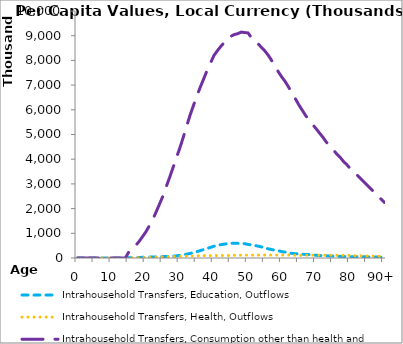
| Category | Intrahousehold Transfers, Education, Outflows | Intrahousehold Transfers, Health, Outflows | Intrahousehold Transfers, Consumption other than health and education, Outflows | Intrahousehold Transfers, Saving, Outflows |
|---|---|---|---|---|
| 0 | 0 | 0 | 0 |  |
|  | 0 | 0 | 0 |  |
| 2 | 0 | 0 | 0 |  |
| 3 | 0 | 0 | 0 |  |
| 4 | 0 | 0 | 0 |  |
| 5 | 0 | 0 | 0 |  |
| 6 | 0 | 0 | 0 |  |
| 7 | 0 | 0 | 0 |  |
| 8 | 0 | 0 | 0 |  |
| 9 | 0 | 0 | 0 |  |
| 10 | 0 | 0 | 0 |  |
| 11 | 0 | 0 | 0 |  |
| 12 | 0 | 0 | 0 |  |
| 13 | 0 | 0 | 0 |  |
| 14 | 0 | 0 | 0 |  |
| 15 | 6898.66 | 5283.315 | 248237.836 |  |
| 16 | 9263.999 | 7232.893 | 376351.637 |  |
| 17 | 17369.687 | 9507.442 | 503630.638 |  |
| 18 | 20683.305 | 12547.604 | 666005.278 |  |
| 19 | 26691.801 | 16215.035 | 858631.54 |  |
| 20 | 31337.736 | 20020.315 | 1054741.593 |  |
| 21 | 35436.758 | 24162.062 | 1300543.452 |  |
| 22 | 40646.974 | 29086.468 | 1555053.769 |  |
| 23 | 45078.263 | 33525.204 | 1859058.324 |  |
| 24 | 48808.917 | 38159.967 | 2178820.773 |  |
| 25 | 55820.035 | 43856.585 | 2502144.842 |  |
| 26 | 60487.497 | 49572.989 | 2895508.065 |  |
| 27 | 70376.137 | 55174.237 | 3267827.011 |  |
| 28 | 75083.46 | 60320.724 | 3670223.696 |  |
| 29 | 87960.635 | 64864.77 | 4070514.872 |  |
| 30 | 106983.762 | 70504.138 | 4462250.354 |  |
| 31 | 124298.205 | 75625.5 | 4892116.498 |  |
| 32 | 155892.588 | 80278.356 | 5349537.712 |  |
| 33 | 185179.708 | 84596.598 | 5787340.105 |  |
| 34 | 218114.581 | 87639.731 | 6182093.733 |  |
| 35 | 256655.219 | 91574.236 | 6565975.264 |  |
| 36 | 298279.693 | 93772.498 | 6923216.338 |  |
| 37 | 344487.798 | 95822.002 | 7259702.148 |  |
| 38 | 384155.788 | 97472.29 | 7598806.048 |  |
| 39 | 432541.035 | 98708.456 | 7901494.403 |  |
| 40 | 477858.419 | 100268.376 | 8200566.88 |  |
| 41 | 508624.412 | 99748.705 | 8392157.778 |  |
| 42 | 540060.569 | 100553.999 | 8565830.409 |  |
| 43 | 559664.053 | 100312.871 | 8724307.423 |  |
| 44 | 583237.356 | 99236.506 | 8875114.278 |  |
| 45 | 593608.674 | 113003.067 | 8978274.063 |  |
| 46 | 599738.797 | 113028.297 | 9047861.033 |  |
| 47 | 595763.359 | 113192.237 | 9082012.607 |  |
| 48 | 587447.403 | 115019.595 | 9147550.838 |  |
| 49 | 579122.002 | 115270.994 | 9126893.057 |  |
| 50 | 550232.024 | 116638.486 | 9112160.468 |  |
| 51 | 528666.956 | 115938.99 | 8917197.42 |  |
| 52 | 507822.441 | 118515.163 | 8805148.789 |  |
| 53 | 478683.746 | 118119.15 | 8664357.739 |  |
| 54 | 447897.24 | 119044.073 | 8517620.146 |  |
| 55 | 406220.54 | 120230.331 | 8372814.642 |  |
| 56 | 370515.06 | 119021.212 | 8195481.05 |  |
| 57 | 341215.076 | 118159.129 | 7981334.539 |  |
| 58 | 307058.746 | 119112.411 | 7743020.042 |  |
| 59 | 287911.377 | 118459.936 | 7515543.152 |  |
| 60 | 255679.255 | 120317.462 | 7310929.834 |  |
| 61 | 236258.799 | 121108.631 | 7124678.1 |  |
| 62 | 203028.737 | 121879.649 | 6896699.916 |  |
| 63 | 184991.571 | 121744.584 | 6654571.581 |  |
| 64 | 173269.928 | 111506.816 | 6425259.826 |  |
| 65 | 159552.713 | 110079.832 | 6179565.474 |  |
| 66 | 150683.007 | 110067.709 | 5965412.866 |  |
| 67 | 143861.796 | 111180.661 | 5748792.328 |  |
| 68 | 134857.646 | 113820.407 | 5585292.416 |  |
| 69 | 126715.711 | 116936.538 | 5393289.898 |  |
| 70 | 108701.128 | 117185.539 | 5233468.236 |  |
| 71 | 102825.419 | 112847.608 | 5055479.087 |  |
| 72 | 93952.613 | 115103.775 | 4885044.876 |  |
| 73 | 88480.448 | 113756.023 | 4687752.334 |  |
| 74 | 80152.189 | 113112.079 | 4534274.088 |  |
| 75 | 76231.621 | 114574.448 | 4385610.965 |  |
| 76 | 70400.895 | 111967.747 | 4216882.027 |  |
| 77 | 66044.417 | 110233.882 | 4081325.05 |  |
| 78 | 61367.842 | 110026.871 | 3910464.655 |  |
| 79 | 60380.941 | 108088.059 | 3780563.209 |  |
| 80 | 55458.848 | 104325.043 | 3617592.975 |  |
| 81 | 51950.163 | 98638.117 | 3501190.664 |  |
| 82 | 53313.407 | 94476.55 | 3362263.687 |  |
| 83 | 49371.033 | 90314.983 | 3223336.71 |  |
| 84 | 46072.052 | 86153.416 | 3084409.734 |  |
| 85 | 46486.692 | 81991.85 | 2945482.757 |  |
| 86 | 43224.152 | 77830.283 | 2806555.781 |  |
| 87 | 39961.612 | 73668.716 | 2667628.804 |  |
| 88 | 36699.071 | 69507.149 | 2528701.827 |  |
| 89 | 33436.531 | 65345.582 | 2389774.851 |  |
| 90+ | 30173.991 | 61184.016 | 2250847.874 |  |